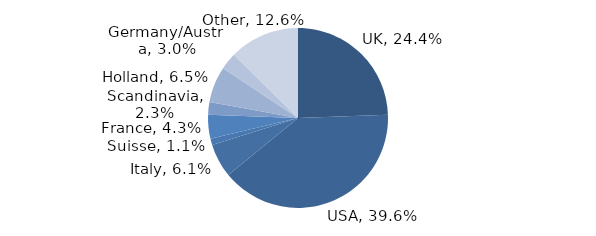
| Category | Investment Style |
|---|---|
| UK | 0.244 |
| USA | 0.396 |
| Italy | 0.061 |
| Suisse | 0.011 |
| France | 0.043 |
| Scandinavia | 0.023 |
| Holland | 0.065 |
| Germany/Austria | 0.03 |
| Other | 0.126 |